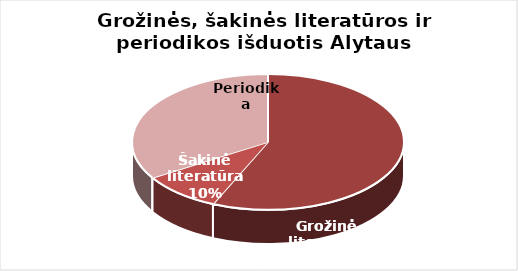
| Category | Series 0 |
|---|---|
| Grožinė literatūra | 456852 |
| Šakinė literatūra | 76795 |
| Periodika | 273063 |